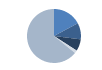
| Category | Series 0 |
|---|---|
| ARRASTRE | 140 |
| CERCO | 80 |
| PALANGRE | 58 |
| REDES DE ENMALLE | 14 |
| ARTES MENORES | 523 |
| SIN TIPO ASIGNADO | 0 |